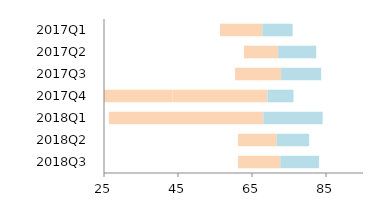
| Category | Blank | Bottom | Top |
|---|---|---|---|
| 2017Q1 | 56.349 | 11.436 | 8.198 |
| 2017Q2 | 62.821 | 9.231 | 10.301 |
| 2017Q3 | 60.432 | 12.445 | 10.827 |
| 2017Q4 | 43.564 | 25.661 | 7.005 |
| 2018Q1 | 26.316 | 41.744 | 16.031 |
| 2018Q2 | 61.224 | 10.477 | 8.745 |
| 2018Q3 | 61.224 | 11.403 | 10.519 |